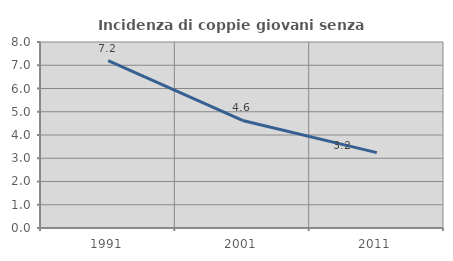
| Category | Incidenza di coppie giovani senza figli |
|---|---|
| 1991.0 | 7.201 |
| 2001.0 | 4.625 |
| 2011.0 | 3.242 |